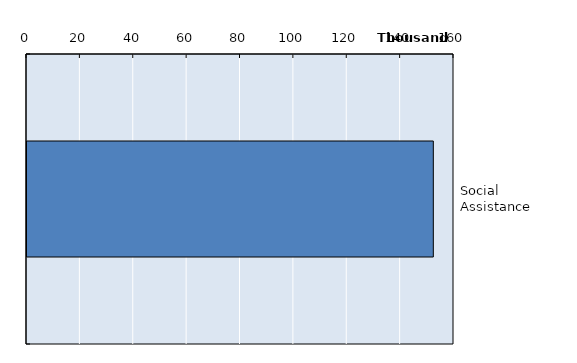
| Category | Series 0 |
|---|---|
| Social Assistance | 152253 |